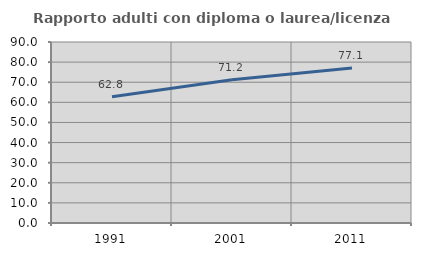
| Category | Rapporto adulti con diploma o laurea/licenza media  |
|---|---|
| 1991.0 | 62.764 |
| 2001.0 | 71.216 |
| 2011.0 | 77.068 |